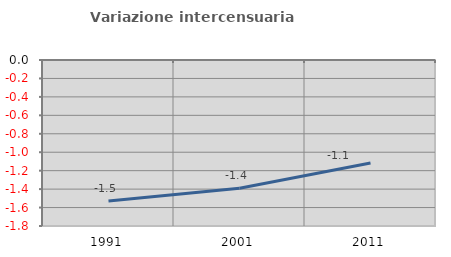
| Category | Variazione intercensuaria annua |
|---|---|
| 1991.0 | -1.53 |
| 2001.0 | -1.39 |
| 2011.0 | -1.117 |